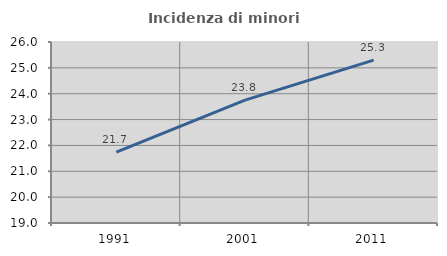
| Category | Incidenza di minori stranieri |
|---|---|
| 1991.0 | 21.739 |
| 2001.0 | 23.75 |
| 2011.0 | 25.298 |